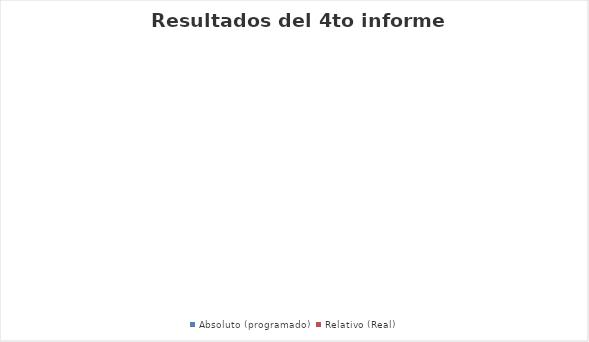
| Category |  Absoluto (programado) | Relativo (Real) |
|---|---|---|
| Diseño y actualización de los Manuales de procesos y procedimientos con motivo de la implementación del Sistema Municipal  de control interno y  Anticorrupción | 1 | 0.6 |
| Conformación del Oranismo Público Descentralizado denominado "Seccretaria Ejecutiva" del Sistema Municipal Anticorrupción | 1 | 0.7 |
| Implementación del Sistema Municipal Anticorrupción | 1 | 0.5 |
| Implementación del Sistema de Control Interno de la Administración Pública Municipal | 1 | 0.5 |
| Desconcentración Administrativa Municipal | 1 | 0 |